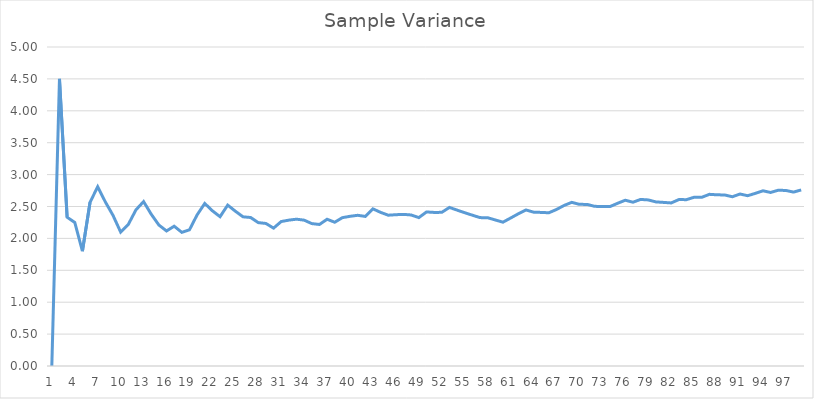
| Category | Series 0 |
|---|---|
| 0 | 0 |
| 1 | 4.5 |
| 2 | 2.333 |
| 3 | 2.25 |
| 4 | 1.8 |
| 5 | 2.567 |
| 6 | 2.81 |
| 7 | 2.571 |
| 8 | 2.361 |
| 9 | 2.1 |
| 10 | 2.218 |
| 11 | 2.447 |
| 12 | 2.577 |
| 13 | 2.379 |
| 14 | 2.21 |
| 15 | 2.117 |
| 16 | 2.191 |
| 17 | 2.095 |
| 18 | 2.135 |
| 19 | 2.368 |
| 20 | 2.548 |
| 21 | 2.433 |
| 22 | 2.34 |
| 23 | 2.522 |
| 24 | 2.427 |
| 25 | 2.338 |
| 26 | 2.328 |
| 27 | 2.247 |
| 28 | 2.234 |
| 29 | 2.161 |
| 30 | 2.265 |
| 31 | 2.286 |
| 32 | 2.301 |
| 33 | 2.286 |
| 34 | 2.232 |
| 35 | 2.218 |
| 36 | 2.3 |
| 37 | 2.253 |
| 38 | 2.325 |
| 39 | 2.346 |
| 40 | 2.362 |
| 41 | 2.344 |
| 42 | 2.463 |
| 43 | 2.408 |
| 44 | 2.364 |
| 45 | 2.371 |
| 46 | 2.377 |
| 47 | 2.367 |
| 48 | 2.326 |
| 49 | 2.415 |
| 50 | 2.407 |
| 51 | 2.408 |
| 52 | 2.485 |
| 53 | 2.443 |
| 54 | 2.403 |
| 55 | 2.364 |
| 56 | 2.326 |
| 57 | 2.324 |
| 58 | 2.289 |
| 59 | 2.254 |
| 60 | 2.319 |
| 61 | 2.385 |
| 62 | 2.446 |
| 63 | 2.412 |
| 64 | 2.407 |
| 65 | 2.402 |
| 66 | 2.453 |
| 67 | 2.517 |
| 68 | 2.565 |
| 69 | 2.533 |
| 70 | 2.533 |
| 71 | 2.502 |
| 72 | 2.501 |
| 73 | 2.499 |
| 74 | 2.551 |
| 75 | 2.598 |
| 76 | 2.567 |
| 77 | 2.611 |
| 78 | 2.603 |
| 79 | 2.572 |
| 80 | 2.564 |
| 81 | 2.556 |
| 82 | 2.608 |
| 83 | 2.607 |
| 84 | 2.645 |
| 85 | 2.644 |
| 86 | 2.691 |
| 87 | 2.683 |
| 88 | 2.681 |
| 89 | 2.653 |
| 90 | 2.696 |
| 91 | 2.669 |
| 92 | 2.706 |
| 93 | 2.746 |
| 94 | 2.72 |
| 95 | 2.755 |
| 96 | 2.751 |
| 97 | 2.726 |
| 98 | 2.76 |